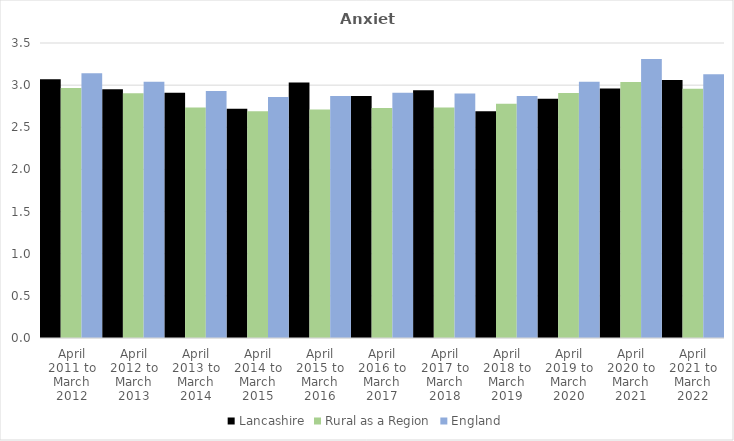
| Category | Lancashire | Rural as a Region | England |
|---|---|---|---|
| April 2011 to March 2012 | 3.07 | 2.967 | 3.14 |
| April 2012 to March 2013 | 2.95 | 2.904 | 3.04 |
| April 2013 to March 2014 | 2.91 | 2.734 | 2.93 |
| April 2014 to March 2015 | 2.72 | 2.691 | 2.86 |
| April 2015 to March 2016 | 3.03 | 2.711 | 2.87 |
| April 2016 to March 2017 | 2.87 | 2.729 | 2.91 |
| April 2017 to March 2018 | 2.94 | 2.736 | 2.9 |
| April 2018 to March 2019 | 2.69 | 2.78 | 2.87 |
| April 2019 to March 2020 | 2.84 | 2.908 | 3.04 |
| April 2020 to March 2021 | 2.96 | 3.036 | 3.31 |
| April 2021 to March 2022 | 3.06 | 2.956 | 3.13 |